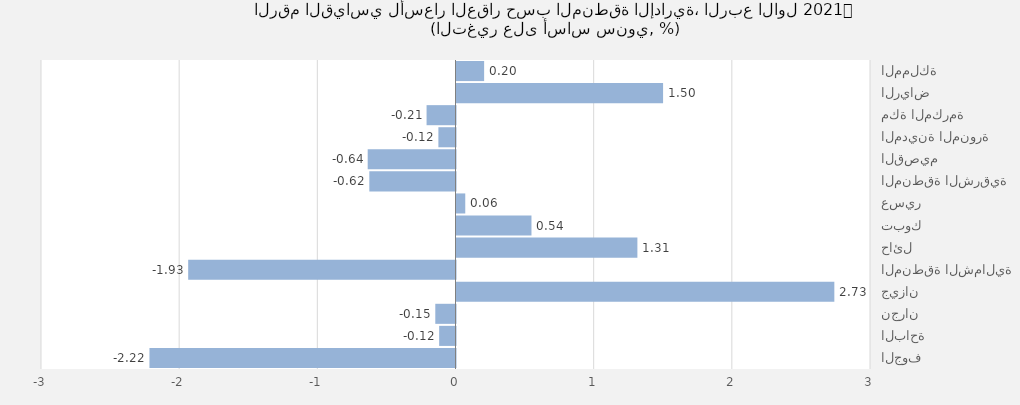
| Category | 2021 |
|---|---|
| المملكة | 0.2 |
| الرياض | 1.495 |
| مكة المكرمة | -0.209 |
| المدينة المنورة | -0.124 |
| القصيم | -0.635 |
| المنطقة الشرقية | -0.624 |
| عسير | 0.063 |
| تبوك | 0.543 |
| حائل | 1.309 |
| المنطقة الشمالية | -1.935 |
| جيزان | 2.735 |
| نجران | -0.146 |
| الباحة | -0.118 |
| الجوف | -2.215 |